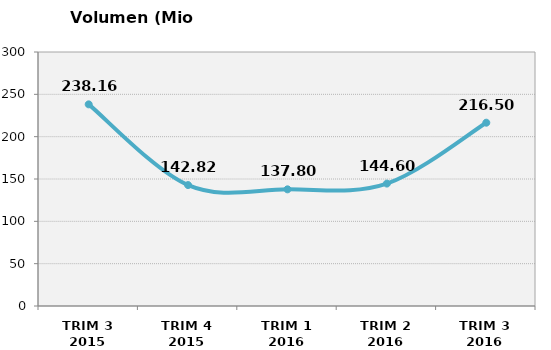
| Category | Volumen (Mio consumiciones) |
|---|---|
| TRIM 3 2015 | 238.159 |
| TRIM 4 2015 | 142.817 |
| TRIM 1 2016 | 137.8 |
| TRIM 2 2016 | 144.6 |
| TRIM 3 2016 | 216.5 |